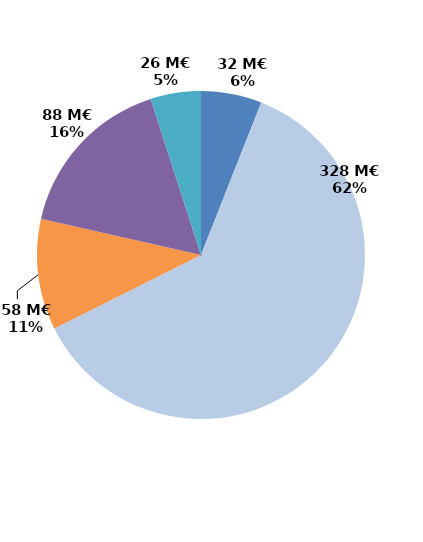
| Category | Series 0 |
|---|---|
| Contrats aidés marchand (hors IAE) | 31.899 |
| Contrats aidés non marchand (hors IAE) | 328.474 |
| Insertion par l'activité économique | 58.277 |
| Mesures en faveur des handicapés | 87.883 |
| Autres emplois aidés | 26.457 |